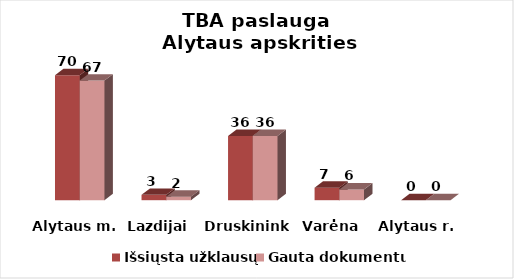
| Category | Išsiųsta užklausų | Gauta dokumentų |
|---|---|---|
| Alytaus m. | 70 | 67 |
| Lazdijai | 3 | 2 |
| Druskininkai | 36 | 36 |
| Varėna | 7 | 6 |
| Alytaus r. | 0 | 0 |